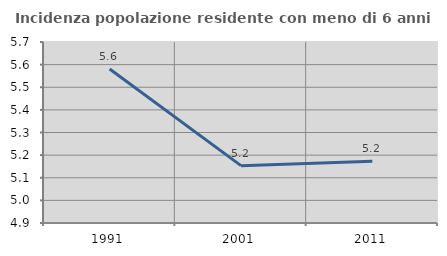
| Category | Incidenza popolazione residente con meno di 6 anni |
|---|---|
| 1991.0 | 5.581 |
| 2001.0 | 5.153 |
| 2011.0 | 5.172 |